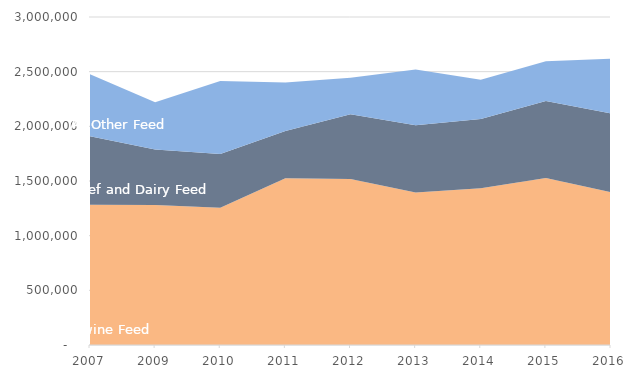
| Category | swine feed | beef and dairy feed | All Other feed |
|---|---|---|---|
| 2007.0 | 1281855 | 626555 | 568946 |
| 2009.0 | 1281005 | 506589 | 432845 |
| 2010.0 | 1255042 | 492327 | 667640 |
| 2011.0 | 1524580 | 431686 | 443644 |
| 2012.0 | 1519404 | 592245 | 333286 |
| 2013.0 | 1395658 | 614874 | 509249 |
| 2014.0 | 1434619.996 | 631390.379 | 360025.052 |
| 2015.0 | 1527720.561 | 703940.2 | 364463.193 |
| 2016.0 | 1396921.966 | 721505.437 | 499250.104 |